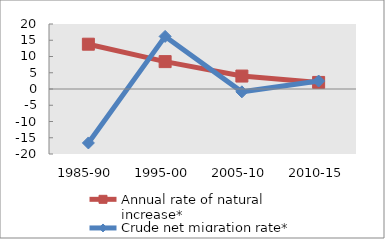
| Category | Annual rate of natural increase* | Crude net migration rate* |
|---|---|---|
| 1985-90 | 13.785 | -16.597 |
| 1995-00 | 8.426 | 16.184 |
| 2005-10 | 3.982 | -0.875 |
| 2010-15 | 2.023 | 2.439 |